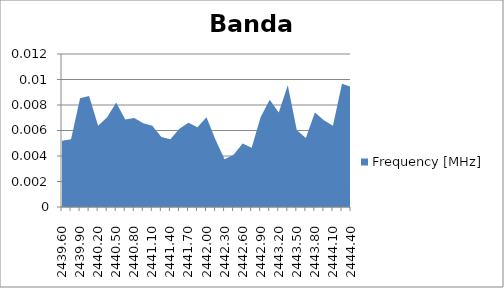
| Category | Frequency [MHz] |
|---|---|
| 2439.6 | 0.005 |
| 2439.75 | 0.005 |
| 2439.9 | 0.009 |
| 2440.05 | 0.009 |
| 2440.2 | 0.006 |
| 2440.35 | 0.007 |
| 2440.5 | 0.008 |
| 2440.65 | 0.007 |
| 2440.8 | 0.007 |
| 2440.95 | 0.007 |
| 2441.1 | 0.006 |
| 2441.25 | 0.005 |
| 2441.4 | 0.005 |
| 2441.55 | 0.006 |
| 2441.7 | 0.007 |
| 2441.85 | 0.006 |
| 2442.0 | 0.007 |
| 2442.15 | 0.005 |
| 2442.3 | 0.004 |
| 2442.45 | 0.004 |
| 2442.6 | 0.005 |
| 2442.75 | 0.005 |
| 2442.9 | 0.007 |
| 2443.05 | 0.008 |
| 2443.2 | 0.007 |
| 2443.35 | 0.01 |
| 2443.5 | 0.006 |
| 2443.65 | 0.005 |
| 2443.8 | 0.007 |
| 2443.95 | 0.007 |
| 2444.1 | 0.006 |
| 2444.25 | 0.01 |
| 2444.4 | 0.009 |